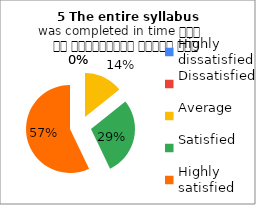
| Category | 5 The entire syllabus
was completed in time समय पर पाठ्यक्रम पूर्ण हुआ |
|---|---|
| Highly dissatisfied | 0 |
| Dissatisfied | 0 |
| Average | 2 |
| Satisfied | 4 |
| Highly satisfied | 8 |